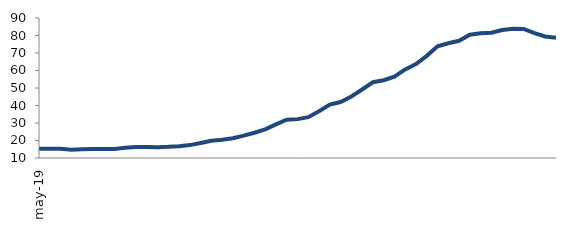
| Category | Series 0 |
|---|---|
| 2019-05-01 | 15.319 |
| 2019-06-01 | 15.27 |
| 2019-07-01 | 15.317 |
| 2019-08-01 | 14.744 |
| 2019-09-01 | 15.056 |
| 2019-10-01 | 15.116 |
| 2019-11-01 | 15.185 |
| 2019-12-01 | 15.165 |
| 2020-01-01 | 15.917 |
| 2020-02-01 | 16.225 |
| 2020-03-01 | 16.228 |
| 2020-04-01 | 16.172 |
| 2020-05-01 | 16.362 |
| 2020-06-01 | 16.723 |
| 2020-07-01 | 17.365 |
| 2020-08-01 | 18.526 |
| 2020-09-01 | 19.846 |
| 2020-10-01 | 20.404 |
| 2020-11-01 | 21.294 |
| 2020-12-01 | 22.781 |
| 2021-01-01 | 24.447 |
| 2021-02-01 | 26.406 |
| 2021-03-01 | 29.172 |
| 2021-04-01 | 31.839 |
| 2021-05-01 | 32.208 |
| 2021-06-01 | 33.334 |
| 2021-07-01 | 36.745 |
| 2021-08-01 | 40.523 |
| 2021-09-01 | 41.963 |
| 2021-10-01 | 45.141 |
| 2021-11-01 | 49.115 |
| 2021-12-01 | 53.284 |
| 2022-01-01 | 54.418 |
| 2022-02-01 | 56.487 |
| 2022-03-01 | 60.62 |
| 2022-04-01 | 63.634 |
| 2022-05-01 | 68.377 |
| 2022-06-01 | 73.83 |
| 2022-07-01 | 75.57 |
| 2022-08-01 | 76.97 |
| 2022-09-01 | 80.415 |
| 2022-10-01 | 81.287 |
| 2022-11-01 | 81.539 |
| 2022-12-01 | 83.165 |
| 2023-01-01 | 83.881 |
| 2023-02-01 | 83.774 |
| 2023-03-01 | 81.297 |
| 2023-04-01 | 79.408 |
| 2023-05-01 | 78.7 |